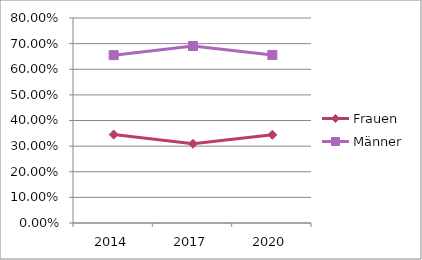
| Category | Frauen | Männer |
|---|---|---|
| 2014.0 | 0.345 | 0.655 |
| 2017.0 | 0.309 | 0.691 |
| 2020.0 | 0.344 | 0.656 |